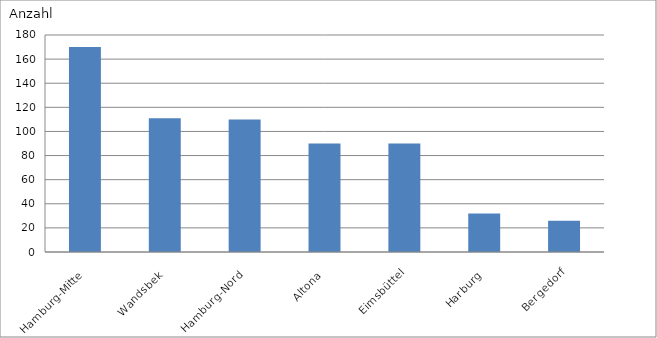
| Category | Hamburg-Mitte |
|---|---|
| Hamburg-Mitte | 170 |
| Wandsbek | 111 |
| Hamburg-Nord | 110 |
| Altona | 90 |
| Eimsbüttel | 90 |
| Harburg | 32 |
| Bergedorf | 26 |